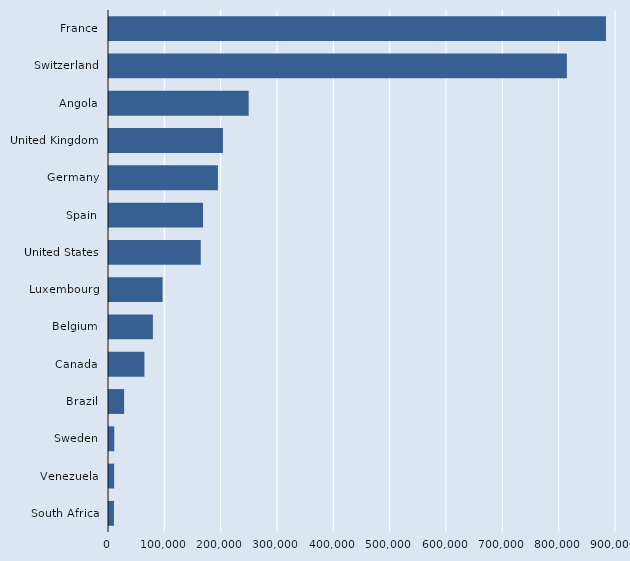
| Category | Series 2 |
|---|---|
| France | 882180 |
| Switzerland | 812810 |
| Angola | 247960 |
| United Kingdom | 202220 |
| Germany | 193340 |
| Spain | 166930 |
| United States | 162860 |
| Luxembourg | 95150 |
| Belgium | 77900 |
| Canada | 62890 |
| Brazil | 26830 |
| Sweden | 9340 |
| Venezuela | 9190 |
| South Africa | 8760 |